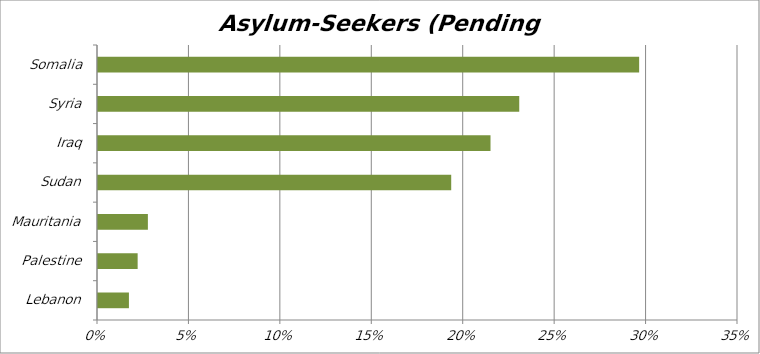
| Category | Asylum-seekers (pending cases) |
|---|---|
| Lebanon | 0.017 |
| Palestine | 0.022 |
| Mauritania | 0.027 |
| Sudan | 0.193 |
| Iraq | 0.215 |
| Syria | 0.23 |
| Somalia | 0.296 |